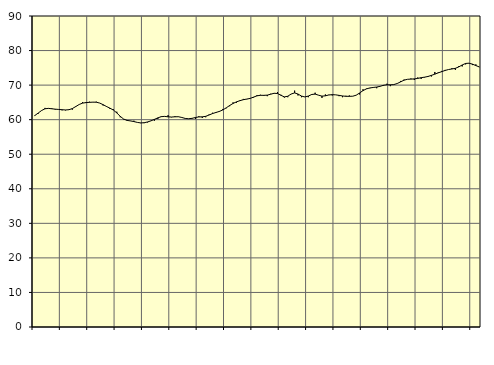
| Category | Piggar | Series 1 |
|---|---|---|
| nan | 61.3 | 61.18 |
| 87.0 | 61.7 | 61.9 |
| 87.0 | 62.6 | 62.64 |
| 87.0 | 63.4 | 63.15 |
| nan | 63.2 | 63.27 |
| 88.0 | 63.3 | 63.15 |
| 88.0 | 62.9 | 63.04 |
| 88.0 | 63 | 62.96 |
| nan | 62.7 | 62.88 |
| 89.0 | 62.7 | 62.81 |
| 89.0 | 62.8 | 62.88 |
| 89.0 | 62.9 | 63.21 |
| nan | 63.9 | 63.79 |
| 90.0 | 64.4 | 64.39 |
| 90.0 | 65.1 | 64.79 |
| 90.0 | 65.1 | 64.94 |
| nan | 65.2 | 65.01 |
| 91.0 | 65.1 | 65.07 |
| 91.0 | 65.2 | 65.05 |
| 91.0 | 64.8 | 64.81 |
| nan | 64.1 | 64.34 |
| 92.0 | 63.7 | 63.81 |
| 92.0 | 63.1 | 63.33 |
| 92.0 | 63 | 62.78 |
| nan | 62.3 | 61.96 |
| 93.0 | 60.7 | 60.97 |
| 93.0 | 60.1 | 60.18 |
| 93.0 | 59.9 | 59.79 |
| nan | 59.6 | 59.64 |
| 94.0 | 59.7 | 59.45 |
| 94.0 | 59.2 | 59.21 |
| 94.0 | 59 | 59.06 |
| nan | 59 | 59.11 |
| 95.0 | 59.2 | 59.34 |
| 95.0 | 59.7 | 59.66 |
| 95.0 | 59.7 | 60.08 |
| nan | 60.2 | 60.52 |
| 96.0 | 61 | 60.87 |
| 96.0 | 60.9 | 60.95 |
| 96.0 | 61.3 | 60.82 |
| nan | 60.7 | 60.76 |
| 97.0 | 61 | 60.83 |
| 97.0 | 60.8 | 60.85 |
| 97.0 | 60.7 | 60.64 |
| nan | 60.4 | 60.36 |
| 98.0 | 60.3 | 60.27 |
| 98.0 | 60.3 | 60.38 |
| 98.0 | 60.2 | 60.63 |
| nan | 61 | 60.79 |
| 99.0 | 60.5 | 60.82 |
| 99.0 | 60.7 | 60.97 |
| 99.0 | 61.5 | 61.35 |
| nan | 62 | 61.77 |
| 0.0 | 62.2 | 62.08 |
| 0.0 | 62.5 | 62.39 |
| 0.0 | 63.1 | 62.82 |
| nan | 63.3 | 63.42 |
| 1.0 | 63.9 | 64.1 |
| 1.0 | 65 | 64.69 |
| 1.0 | 64.9 | 65.15 |
| nan | 65.6 | 65.49 |
| 2.0 | 66 | 65.78 |
| 2.0 | 65.9 | 65.96 |
| 2.0 | 66.1 | 66.15 |
| nan | 66.4 | 66.53 |
| 3.0 | 67.1 | 66.9 |
| 3.0 | 67.2 | 67.05 |
| 3.0 | 66.9 | 67.04 |
| nan | 66.8 | 67.1 |
| 4.0 | 67.5 | 67.36 |
| 4.0 | 67.7 | 67.64 |
| 4.0 | 68 | 67.57 |
| nan | 67.2 | 67.05 |
| 5.0 | 66.4 | 66.59 |
| 5.0 | 66.5 | 66.78 |
| 5.0 | 67.4 | 67.43 |
| nan | 68.4 | 67.74 |
| 6.0 | 67 | 67.41 |
| 6.0 | 66.5 | 66.83 |
| 6.0 | 66.6 | 66.57 |
| nan | 66.5 | 66.83 |
| 7.0 | 67.4 | 67.29 |
| 7.0 | 67.8 | 67.4 |
| 7.0 | 67.1 | 67.08 |
| nan | 66.3 | 66.81 |
| 8.0 | 67.3 | 66.9 |
| 8.0 | 67.2 | 67.14 |
| 8.0 | 67 | 67.24 |
| nan | 67.2 | 67.18 |
| 9.0 | 66.8 | 67.03 |
| 9.0 | 66.5 | 66.86 |
| 9.0 | 66.9 | 66.76 |
| nan | 67 | 66.75 |
| 10.0 | 66.8 | 66.79 |
| 10.0 | 67.1 | 67.08 |
| 10.0 | 67.3 | 67.72 |
| nan | 68.8 | 68.41 |
| 11.0 | 69 | 68.91 |
| 11.0 | 69.1 | 69.18 |
| 11.0 | 69.4 | 69.32 |
| nan | 69.1 | 69.44 |
| 12.0 | 69.7 | 69.65 |
| 12.0 | 69.8 | 69.95 |
| 12.0 | 70.4 | 70.1 |
| nan | 69.7 | 70.09 |
| 13.0 | 70.2 | 70.15 |
| 13.0 | 70.5 | 70.46 |
| 13.0 | 71.2 | 70.95 |
| nan | 71.6 | 71.43 |
| 14.0 | 71.7 | 71.68 |
| 14.0 | 71.9 | 71.74 |
| 14.0 | 71.5 | 71.8 |
| nan | 72.2 | 71.94 |
| 15.0 | 71.8 | 72.15 |
| 15.0 | 72.2 | 72.3 |
| 15.0 | 72.6 | 72.5 |
| nan | 72.5 | 72.82 |
| 16.0 | 73.8 | 73.17 |
| 16.0 | 73.7 | 73.55 |
| 16.0 | 74.1 | 73.89 |
| nan | 74.4 | 74.24 |
| 17.0 | 74.5 | 74.51 |
| 17.0 | 74.9 | 74.67 |
| 17.0 | 74.4 | 74.86 |
| nan | 75.5 | 75.27 |
| 18.0 | 75.4 | 75.83 |
| 18.0 | 76 | 76.27 |
| 18.0 | 76.3 | 76.34 |
| nan | 75.8 | 76.07 |
| 19.0 | 76 | 75.65 |
| 19.0 | 75.2 | 75.27 |